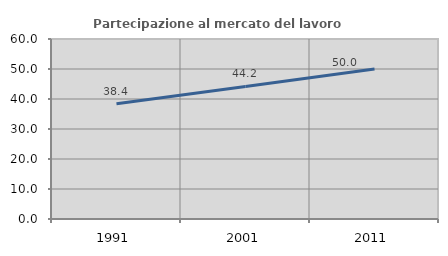
| Category | Partecipazione al mercato del lavoro  femminile |
|---|---|
| 1991.0 | 38.415 |
| 2001.0 | 44.186 |
| 2011.0 | 50 |